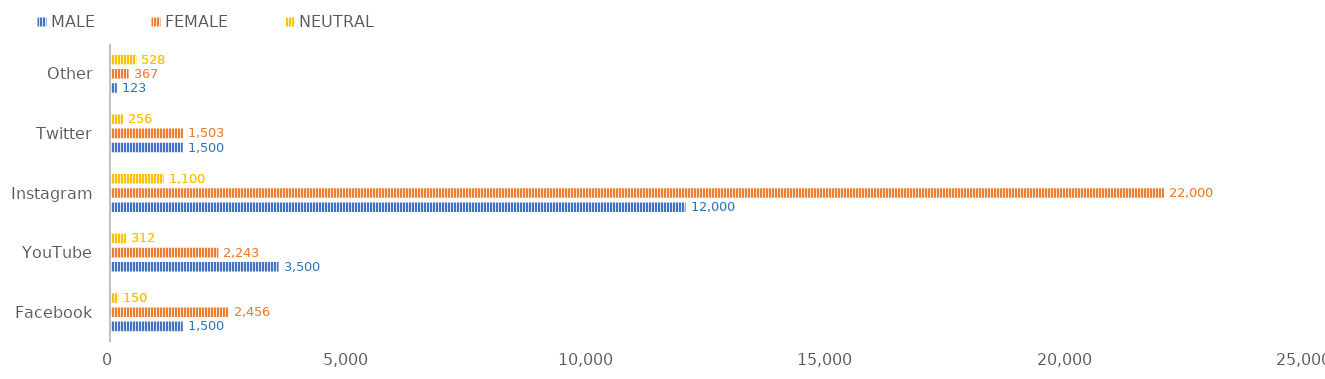
| Category | MALE | FEMALE | NEUTRAL |
|---|---|---|---|
| Facebook | 1500 | 2456 | 150 |
| YouTube | 3500 | 2243 | 312 |
| Instagram | 12000 | 22000 | 1100 |
| Twitter | 1500 | 1503 | 256 |
| Other | 123 | 367 | 528 |